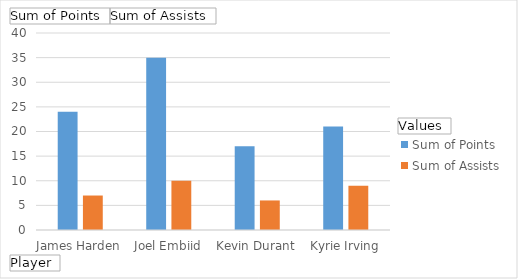
| Category | Sum of Points | Sum of Assists |
|---|---|---|
| James Harden | 24 | 7 |
| Joel Embiid | 35 | 10 |
| Kevin Durant | 17 | 6 |
| Kyrie Irving | 21 | 9 |